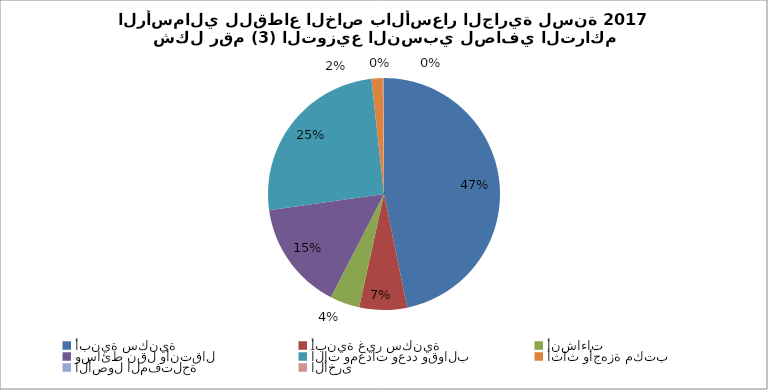
| Category | Series 0 |
|---|---|
| أبنية سكنية | 28400576.25 |
| أبنية غير سكنية | 4047352.084 |
| أنشاءات | 2501224.231 |
| وسائط نقل وأنتقال | 9237575.933 |
| آلات ومعدات وعدد وقوالب | 15473168.317 |
| أثاث وأجهزة مكتب | 943754.472 |
| الأصول المفتلحة | 20946.2 |
| الأخرى  | 88106.84 |